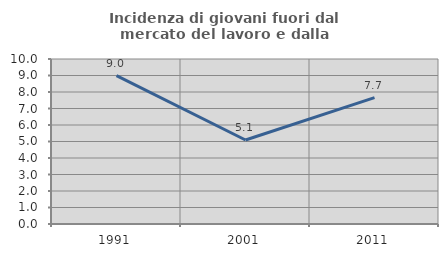
| Category | Incidenza di giovani fuori dal mercato del lavoro e dalla formazione  |
|---|---|
| 1991.0 | 8.989 |
| 2001.0 | 5.089 |
| 2011.0 | 7.655 |